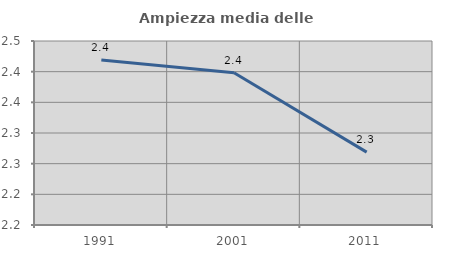
| Category | Ampiezza media delle famiglie |
|---|---|
| 1991.0 | 2.419 |
| 2001.0 | 2.398 |
| 2011.0 | 2.269 |